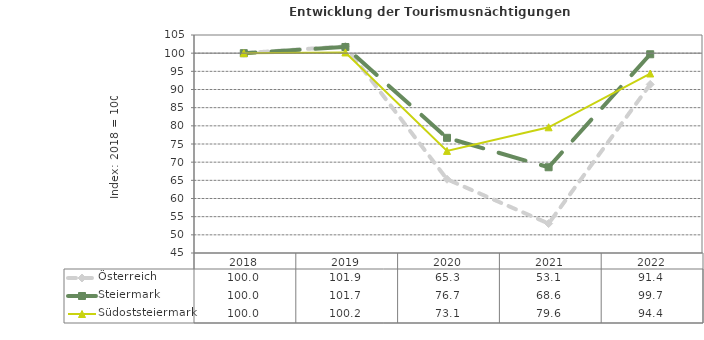
| Category | Österreich | Steiermark | Südoststeiermark |
|---|---|---|---|
| 2022.0 | 91.4 | 99.7 | 94.4 |
| 2021.0 | 53.1 | 68.6 | 79.6 |
| 2020.0 | 65.3 | 76.7 | 73.1 |
| 2019.0 | 101.9 | 101.7 | 100.2 |
| 2018.0 | 100 | 100 | 100 |